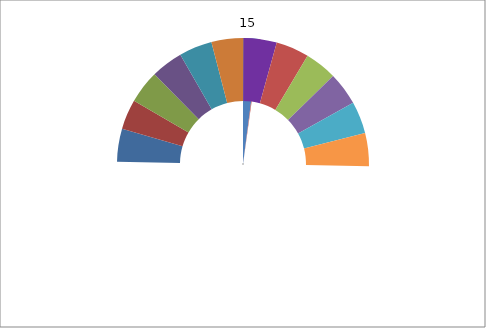
| Category | indicateur |
|---|---|
| 43326.0 | 15 |
| 1.0 | 1 |
| 995069.0 | 714 |